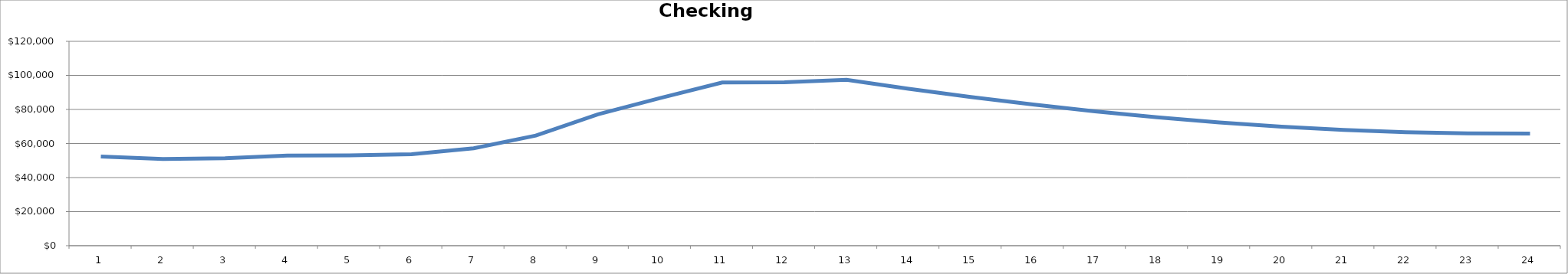
| Category | Checking Account |
|---|---|
| 0 | 52333.333 |
| 1 | 50916.667 |
| 2 | 51375 |
| 3 | 52958.333 |
| 4 | 53075 |
| 5 | 53664.167 |
| 6 | 57230.083 |
| 7 | 64665.775 |
| 8 | 77132.174 |
| 9 | 86691.942 |
| 10 | 95863.664 |
| 11 | 95966.697 |
| 12 | 97430.034 |
| 13 | 92159.869 |
| 14 | 87301.195 |
| 15 | 82874.588 |
| 16 | 78901.651 |
| 17 | 75405.067 |
| 18 | 72408.654 |
| 19 | 69937.42 |
| 20 | 68017.624 |
| 21 | 66676.839 |
| 22 | 65944.014 |
| 23 | 65849.548 |